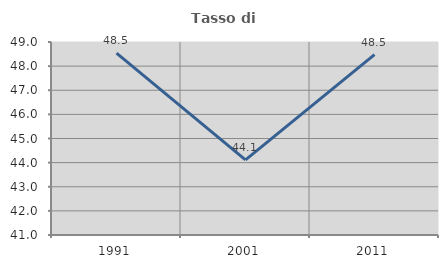
| Category | Tasso di occupazione   |
|---|---|
| 1991.0 | 48.535 |
| 2001.0 | 44.114 |
| 2011.0 | 48.473 |